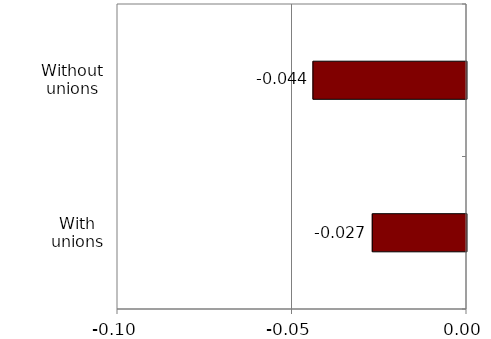
| Category | Series 0 |
|---|---|
| With unions | -0.027 |
| Without unions | -0.044 |